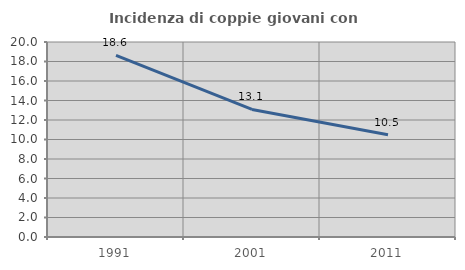
| Category | Incidenza di coppie giovani con figli |
|---|---|
| 1991.0 | 18.618 |
| 2001.0 | 13.084 |
| 2011.0 | 10.485 |